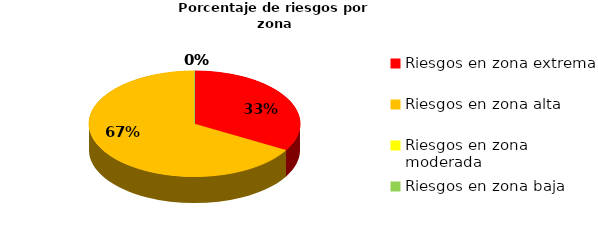
| Category | Series 0 | Series 1 |
|---|---|---|
| Riesgos en zona extrema | 4 | 0.333 |
| Riesgos en zona alta | 8 | 0.667 |
| Riesgos en zona moderada | 0 | 0 |
| Riesgos en zona baja | 0 | 0 |